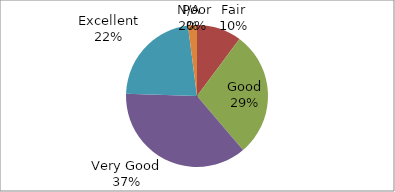
| Category | Series 0 |
|---|---|
| Poor | 0 |
| Fair | 5 |
| Good | 14 |
| Very Good | 18 |
| Excellent | 11 |
| N/A | 1 |